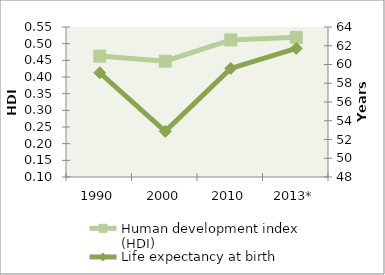
| Category | Human development index (HDI) |
|---|---|
| 1990 | 0.463 |
| 2000 | 0.447 |
| 2010 | 0.511 |
| 2013* | 0.519 |